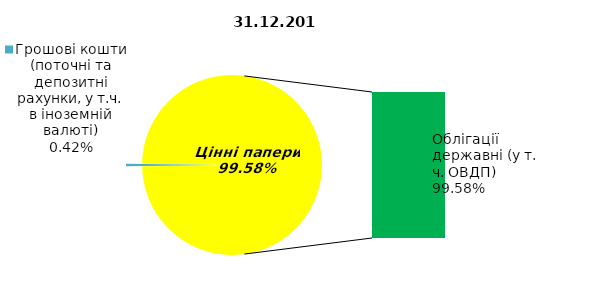
| Category | Series 0 |
|---|---|
| Грошові кошти (поточні та депозитні рахунки, у т.ч. в іноземній валюті) | 0.411 |
| Банківські метали | 0 |
| Нерухомість | 0 |
| Інші активи | 0 |
| Акції | 0 |
| Облігації підприємств | 0 |
| Муніципальні облігації | 0 |
| Облігації державні (у т. ч. ОВДП) | 96.244 |
| Іпотечні сертифікати | 0 |